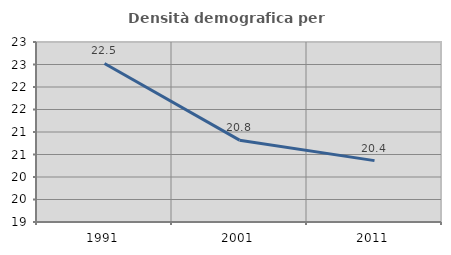
| Category | Densità demografica |
|---|---|
| 1991.0 | 22.522 |
| 2001.0 | 20.818 |
| 2011.0 | 20.364 |